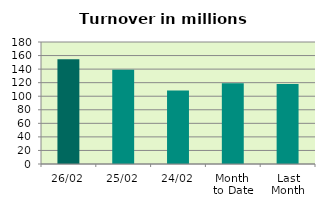
| Category | Series 0 |
|---|---|
| 26/02 | 154.635 |
| 25/02 | 139 |
| 24/02 | 108.407 |
| Month 
to Date | 119.242 |
| Last
Month | 118.136 |